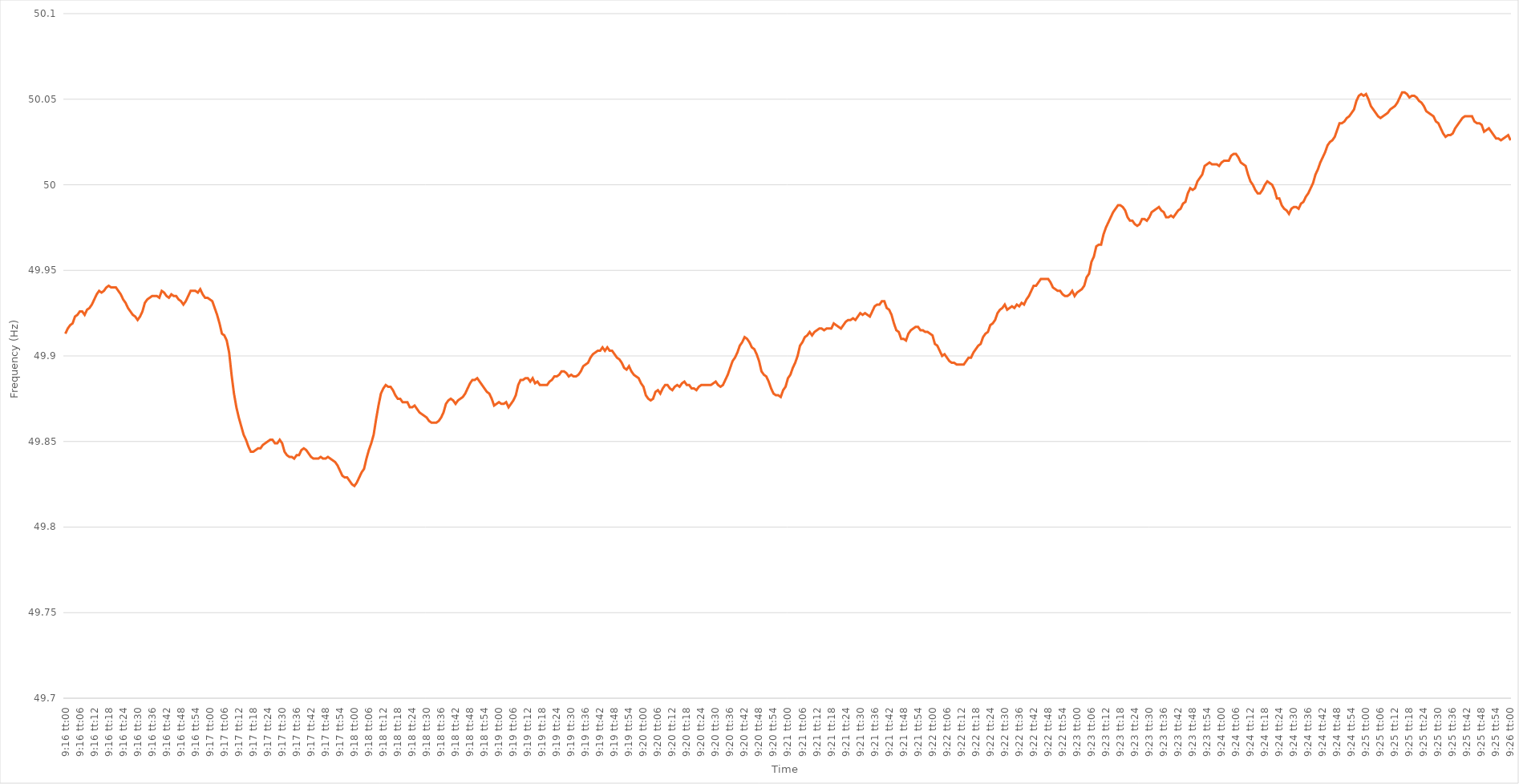
| Category | Series 0 |
|---|---|
| 0.3861111111111111 | 49.913 |
| 0.38612268518518517 | 49.916 |
| 0.3861342592592593 | 49.918 |
| 0.38614583333333335 | 49.919 |
| 0.3861574074074074 | 49.923 |
| 0.3861689814814815 | 49.924 |
| 0.3861805555555555 | 49.926 |
| 0.3861921296296296 | 49.926 |
| 0.38620370370370366 | 49.924 |
| 0.3862152777777778 | 49.927 |
| 0.38622685185185185 | 49.928 |
| 0.38623842592592594 | 49.93 |
| 0.38625 | 49.933 |
| 0.3862615740740741 | 49.936 |
| 0.3862731481481481 | 49.938 |
| 0.38628472222222227 | 49.937 |
| 0.3862962962962963 | 49.938 |
| 0.3863078703703704 | 49.94 |
| 0.38631944444444444 | 49.941 |
| 0.38633101851851853 | 49.94 |
| 0.38634259259259257 | 49.94 |
| 0.3863541666666667 | 49.94 |
| 0.38636574074074076 | 49.938 |
| 0.3863773148148148 | 49.936 |
| 0.3863888888888889 | 49.933 |
| 0.38640046296296293 | 49.931 |
| 0.386412037037037 | 49.928 |
| 0.38642361111111106 | 49.926 |
| 0.3864351851851852 | 49.924 |
| 0.38644675925925925 | 49.923 |
| 0.38645833333333335 | 49.921 |
| 0.3864699074074074 | 49.923 |
| 0.3864814814814815 | 49.926 |
| 0.3864930555555555 | 49.931 |
| 0.38650462962962967 | 49.933 |
| 0.3865162037037037 | 49.934 |
| 0.3865277777777778 | 49.935 |
| 0.38653935185185184 | 49.935 |
| 0.38655092592592594 | 49.935 |
| 0.3865625 | 49.934 |
| 0.3865740740740741 | 49.938 |
| 0.38658564814814816 | 49.937 |
| 0.3865972222222222 | 49.935 |
| 0.3866087962962963 | 49.934 |
| 0.38662037037037034 | 49.936 |
| 0.38663194444444443 | 49.935 |
| 0.38664351851851847 | 49.935 |
| 0.3866550925925926 | 49.933 |
| 0.38666666666666666 | 49.932 |
| 0.38667824074074075 | 49.93 |
| 0.3866898148148148 | 49.932 |
| 0.3867013888888889 | 49.935 |
| 0.3867129629629629 | 49.938 |
| 0.3867245370370371 | 49.938 |
| 0.3867361111111111 | 49.938 |
| 0.3867476851851852 | 49.937 |
| 0.38675925925925925 | 49.939 |
| 0.38677083333333334 | 49.936 |
| 0.3867824074074074 | 49.934 |
| 0.38679398148148153 | 49.934 |
| 0.38680555555555557 | 49.933 |
| 0.38681712962962966 | 49.932 |
| 0.3868287037037037 | 49.928 |
| 0.3868402777777778 | 49.924 |
| 0.38685185185185184 | 49.919 |
| 0.3868634259259259 | 49.913 |
| 0.386875 | 49.912 |
| 0.38688657407407406 | 49.909 |
| 0.38689814814814816 | 49.902 |
| 0.3869097222222222 | 49.889 |
| 0.3869212962962963 | 49.878 |
| 0.38693287037037033 | 49.87 |
| 0.3869444444444445 | 49.864 |
| 0.3869560185185185 | 49.859 |
| 0.3869675925925926 | 49.854 |
| 0.38697916666666665 | 49.851 |
| 0.38699074074074075 | 49.847 |
| 0.3870023148148148 | 49.844 |
| 0.38701388888888894 | 49.844 |
| 0.387025462962963 | 49.845 |
| 0.38703703703703707 | 49.846 |
| 0.3870486111111111 | 49.846 |
| 0.3870601851851852 | 49.848 |
| 0.38707175925925924 | 49.849 |
| 0.3870833333333333 | 49.85 |
| 0.38709490740740743 | 49.851 |
| 0.38710648148148147 | 49.851 |
| 0.38711805555555556 | 49.849 |
| 0.3871296296296296 | 49.849 |
| 0.3871412037037037 | 49.851 |
| 0.38715277777777773 | 49.849 |
| 0.3871643518518519 | 49.844 |
| 0.3871759259259259 | 49.842 |
| 0.3871875 | 49.841 |
| 0.38719907407407406 | 49.841 |
| 0.38721064814814815 | 49.84 |
| 0.3872222222222222 | 49.842 |
| 0.38723379629629634 | 49.842 |
| 0.3872453703703704 | 49.845 |
| 0.3872569444444445 | 49.846 |
| 0.3872685185185185 | 49.845 |
| 0.3872800925925926 | 49.843 |
| 0.38729166666666665 | 49.841 |
| 0.3873032407407407 | 49.84 |
| 0.38731481481481483 | 49.84 |
| 0.3873263888888889 | 49.84 |
| 0.38733796296296297 | 49.841 |
| 0.387349537037037 | 49.84 |
| 0.3873611111111111 | 49.84 |
| 0.38737268518518514 | 49.841 |
| 0.3873842592592593 | 49.84 |
| 0.38739583333333333 | 49.839 |
| 0.3874074074074074 | 49.838 |
| 0.38741898148148146 | 49.836 |
| 0.38743055555555556 | 49.833 |
| 0.3874421296296296 | 49.83 |
| 0.38745370370370374 | 49.829 |
| 0.3874652777777778 | 49.829 |
| 0.3874768518518519 | 49.827 |
| 0.3874884259259259 | 49.825 |
| 0.3875 | 49.824 |
| 0.38751157407407405 | 49.826 |
| 0.3875231481481482 | 49.829 |
| 0.38753472222222224 | 49.832 |
| 0.38754629629629633 | 49.834 |
| 0.38755787037037037 | 49.84 |
| 0.3875694444444444 | 49.845 |
| 0.3875810185185185 | 49.849 |
| 0.38759259259259254 | 49.854 |
| 0.3876041666666667 | 49.863 |
| 0.38761574074074073 | 49.871 |
| 0.3876273148148148 | 49.878 |
| 0.38763888888888887 | 49.881 |
| 0.38765046296296296 | 49.883 |
| 0.387662037037037 | 49.882 |
| 0.38767361111111115 | 49.882 |
| 0.3876851851851852 | 49.88 |
| 0.3876967592592593 | 49.877 |
| 0.3877083333333333 | 49.875 |
| 0.3877199074074074 | 49.875 |
| 0.38773148148148145 | 49.873 |
| 0.3877430555555556 | 49.873 |
| 0.38775462962962964 | 49.873 |
| 0.38776620370370374 | 49.87 |
| 0.3877777777777778 | 49.87 |
| 0.3877893518518518 | 49.871 |
| 0.3878009259259259 | 49.869 |
| 0.38781249999999995 | 49.867 |
| 0.3878240740740741 | 49.866 |
| 0.38783564814814814 | 49.865 |
| 0.38784722222222223 | 49.864 |
| 0.38785879629629627 | 49.862 |
| 0.38787037037037037 | 49.861 |
| 0.3878819444444444 | 49.861 |
| 0.38789351851851855 | 49.861 |
| 0.3879050925925926 | 49.862 |
| 0.3879166666666667 | 49.864 |
| 0.3879282407407407 | 49.867 |
| 0.3879398148148148 | 49.872 |
| 0.38795138888888886 | 49.874 |
| 0.387962962962963 | 49.875 |
| 0.38797453703703705 | 49.874 |
| 0.38798611111111114 | 49.872 |
| 0.3879976851851852 | 49.874 |
| 0.3880092592592593 | 49.875 |
| 0.3880208333333333 | 49.876 |
| 0.38803240740740735 | 49.878 |
| 0.3880439814814815 | 49.881 |
| 0.38805555555555554 | 49.884 |
| 0.38806712962962964 | 49.886 |
| 0.3880787037037037 | 49.886 |
| 0.38809027777777777 | 49.887 |
| 0.3881018518518518 | 49.885 |
| 0.38811342592592596 | 49.883 |
| 0.388125 | 49.881 |
| 0.3881365740740741 | 49.879 |
| 0.38814814814814813 | 49.878 |
| 0.3881597222222222 | 49.875 |
| 0.38817129629629626 | 49.871 |
| 0.3881828703703704 | 49.872 |
| 0.38819444444444445 | 49.873 |
| 0.38820601851851855 | 49.872 |
| 0.3882175925925926 | 49.872 |
| 0.3882291666666667 | 49.873 |
| 0.3882407407407407 | 49.87 |
| 0.38825231481481487 | 49.872 |
| 0.3882638888888889 | 49.874 |
| 0.38827546296296295 | 49.877 |
| 0.38828703703703704 | 49.883 |
| 0.3882986111111111 | 49.886 |
| 0.3883101851851852 | 49.886 |
| 0.3883217592592592 | 49.887 |
| 0.38833333333333336 | 49.887 |
| 0.3883449074074074 | 49.885 |
| 0.3883564814814815 | 49.887 |
| 0.38836805555555554 | 49.884 |
| 0.38837962962962963 | 49.885 |
| 0.38839120370370367 | 49.883 |
| 0.3884027777777778 | 49.883 |
| 0.38841435185185186 | 49.883 |
| 0.38842592592592595 | 49.883 |
| 0.3884375 | 49.885 |
| 0.3884490740740741 | 49.886 |
| 0.3884606481481481 | 49.888 |
| 0.3884722222222223 | 49.888 |
| 0.3884837962962963 | 49.889 |
| 0.38849537037037035 | 49.891 |
| 0.38850694444444445 | 49.891 |
| 0.3885185185185185 | 49.89 |
| 0.3885300925925926 | 49.888 |
| 0.3885416666666666 | 49.889 |
| 0.38855324074074077 | 49.888 |
| 0.3885648148148148 | 49.888 |
| 0.3885763888888889 | 49.889 |
| 0.38858796296296294 | 49.891 |
| 0.38859953703703703 | 49.894 |
| 0.3886111111111111 | 49.895 |
| 0.3886226851851852 | 49.896 |
| 0.38863425925925926 | 49.899 |
| 0.38864583333333336 | 49.901 |
| 0.3886574074074074 | 49.902 |
| 0.3886689814814815 | 49.903 |
| 0.38868055555555553 | 49.903 |
| 0.3886921296296297 | 49.905 |
| 0.3887037037037037 | 49.903 |
| 0.3887152777777778 | 49.905 |
| 0.38872685185185185 | 49.903 |
| 0.38873842592592595 | 49.903 |
| 0.38875 | 49.901 |
| 0.388761574074074 | 49.899 |
| 0.3887731481481482 | 49.898 |
| 0.3887847222222222 | 49.896 |
| 0.3887962962962963 | 49.893 |
| 0.38880787037037035 | 49.892 |
| 0.38881944444444444 | 49.894 |
| 0.3888310185185185 | 49.891 |
| 0.38884259259259263 | 49.889 |
| 0.38885416666666667 | 49.888 |
| 0.38886574074074076 | 49.887 |
| 0.3888773148148148 | 49.884 |
| 0.3888888888888889 | 49.882 |
| 0.38890046296296293 | 49.877 |
| 0.3889120370370371 | 49.875 |
| 0.3889236111111111 | 49.874 |
| 0.3889351851851852 | 49.875 |
| 0.38894675925925926 | 49.879 |
| 0.38895833333333335 | 49.88 |
| 0.3889699074074074 | 49.878 |
| 0.38898148148148143 | 49.881 |
| 0.3889930555555556 | 49.883 |
| 0.3890046296296296 | 49.883 |
| 0.3890162037037037 | 49.881 |
| 0.38902777777777775 | 49.88 |
| 0.38903935185185184 | 49.882 |
| 0.3890509259259259 | 49.883 |
| 0.38906250000000003 | 49.882 |
| 0.38907407407407407 | 49.884 |
| 0.38908564814814817 | 49.885 |
| 0.3890972222222222 | 49.883 |
| 0.3891087962962963 | 49.883 |
| 0.38912037037037034 | 49.881 |
| 0.3891319444444445 | 49.881 |
| 0.3891435185185185 | 49.88 |
| 0.3891550925925926 | 49.882 |
| 0.38916666666666666 | 49.883 |
| 0.38917824074074076 | 49.883 |
| 0.3891898148148148 | 49.883 |
| 0.38920138888888883 | 49.883 |
| 0.389212962962963 | 49.883 |
| 0.389224537037037 | 49.884 |
| 0.3892361111111111 | 49.885 |
| 0.38924768518518515 | 49.883 |
| 0.38925925925925925 | 49.882 |
| 0.3892708333333333 | 49.883 |
| 0.38928240740740744 | 49.886 |
| 0.3892939814814815 | 49.889 |
| 0.38930555555555557 | 49.893 |
| 0.3893171296296296 | 49.897 |
| 0.3893287037037037 | 49.899 |
| 0.38934027777777774 | 49.902 |
| 0.3893518518518519 | 49.906 |
| 0.38936342592592593 | 49.908 |
| 0.389375 | 49.911 |
| 0.38938657407407407 | 49.91 |
| 0.38939814814814816 | 49.908 |
| 0.3894097222222222 | 49.905 |
| 0.38942129629629635 | 49.904 |
| 0.3894328703703704 | 49.901 |
| 0.3894444444444445 | 49.897 |
| 0.3894560185185185 | 49.891 |
| 0.38946759259259256 | 49.889 |
| 0.38947916666666665 | 49.888 |
| 0.3894907407407407 | 49.885 |
| 0.38950231481481484 | 49.881 |
| 0.3895138888888889 | 49.878 |
| 0.389525462962963 | 49.877 |
| 0.389537037037037 | 49.877 |
| 0.3895486111111111 | 49.876 |
| 0.38956018518518515 | 49.88 |
| 0.3895717592592593 | 49.882 |
| 0.38958333333333334 | 49.887 |
| 0.38959490740740743 | 49.889 |
| 0.38960648148148147 | 49.893 |
| 0.38961805555555556 | 49.896 |
| 0.3896296296296296 | 49.9 |
| 0.38964120370370375 | 49.906 |
| 0.3896527777777778 | 49.908 |
| 0.3896643518518519 | 49.911 |
| 0.3896759259259259 | 49.912 |
| 0.38968749999999996 | 49.914 |
| 0.38969907407407406 | 49.912 |
| 0.3897106481481481 | 49.914 |
| 0.38972222222222225 | 49.915 |
| 0.3897337962962963 | 49.916 |
| 0.3897453703703704 | 49.916 |
| 0.3897569444444444 | 49.915 |
| 0.3897685185185185 | 49.916 |
| 0.38978009259259255 | 49.916 |
| 0.3897916666666667 | 49.916 |
| 0.38980324074074074 | 49.919 |
| 0.38981481481481484 | 49.918 |
| 0.3898263888888889 | 49.917 |
| 0.38983796296296297 | 49.916 |
| 0.389849537037037 | 49.918 |
| 0.38986111111111116 | 49.92 |
| 0.3898726851851852 | 49.921 |
| 0.3898842592592593 | 49.921 |
| 0.38989583333333333 | 49.922 |
| 0.38990740740740737 | 49.921 |
| 0.38991898148148146 | 49.923 |
| 0.3899305555555555 | 49.925 |
| 0.38994212962962965 | 49.924 |
| 0.3899537037037037 | 49.925 |
| 0.3899652777777778 | 49.924 |
| 0.3899768518518518 | 49.923 |
| 0.3899884259259259 | 49.926 |
| 0.38999999999999996 | 49.929 |
| 0.3900115740740741 | 49.93 |
| 0.39002314814814815 | 49.93 |
| 0.39003472222222224 | 49.932 |
| 0.3900462962962963 | 49.932 |
| 0.3900578703703704 | 49.928 |
| 0.3900694444444444 | 49.927 |
| 0.39008101851851856 | 49.924 |
| 0.3900925925925926 | 49.919 |
| 0.3901041666666667 | 49.915 |
| 0.39011574074074074 | 49.914 |
| 0.39012731481481483 | 49.91 |
| 0.39013888888888887 | 49.91 |
| 0.390150462962963 | 49.909 |
| 0.39016203703703706 | 49.913 |
| 0.3901736111111111 | 49.915 |
| 0.3901851851851852 | 49.916 |
| 0.39019675925925923 | 49.917 |
| 0.3902083333333333 | 49.917 |
| 0.39021990740740736 | 49.915 |
| 0.3902314814814815 | 49.915 |
| 0.39024305555555555 | 49.914 |
| 0.39025462962962965 | 49.914 |
| 0.3902662037037037 | 49.913 |
| 0.3902777777777778 | 49.912 |
| 0.3902893518518518 | 49.907 |
| 0.39030092592592597 | 49.906 |
| 0.3903125 | 49.903 |
| 0.3903240740740741 | 49.9 |
| 0.39033564814814814 | 49.901 |
| 0.39034722222222223 | 49.899 |
| 0.3903587962962963 | 49.897 |
| 0.3903703703703704 | 49.896 |
| 0.39038194444444446 | 49.896 |
| 0.3903935185185185 | 49.895 |
| 0.3904050925925926 | 49.895 |
| 0.39041666666666663 | 49.895 |
| 0.39042824074074073 | 49.895 |
| 0.39043981481481477 | 49.897 |
| 0.3904513888888889 | 49.899 |
| 0.39046296296296296 | 49.899 |
| 0.39047453703703705 | 49.902 |
| 0.3904861111111111 | 49.904 |
| 0.3904976851851852 | 49.906 |
| 0.3905092592592592 | 49.907 |
| 0.3905208333333334 | 49.911 |
| 0.3905324074074074 | 49.913 |
| 0.3905439814814815 | 49.914 |
| 0.39055555555555554 | 49.918 |
| 0.39056712962962964 | 49.919 |
| 0.3905787037037037 | 49.921 |
| 0.39059027777777783 | 49.925 |
| 0.39060185185185187 | 49.927 |
| 0.39061342592592596 | 49.928 |
| 0.390625 | 49.93 |
| 0.39063657407407404 | 49.927 |
| 0.39064814814814813 | 49.928 |
| 0.39065972222222217 | 49.929 |
| 0.3906712962962963 | 49.928 |
| 0.39068287037037036 | 49.93 |
| 0.39069444444444446 | 49.929 |
| 0.3907060185185185 | 49.931 |
| 0.3907175925925926 | 49.93 |
| 0.3907291666666666 | 49.933 |
| 0.3907407407407408 | 49.935 |
| 0.3907523148148148 | 49.938 |
| 0.3907638888888889 | 49.941 |
| 0.39077546296296295 | 49.941 |
| 0.39078703703703704 | 49.943 |
| 0.3907986111111111 | 49.945 |
| 0.39081018518518523 | 49.945 |
| 0.39082175925925927 | 49.945 |
| 0.39083333333333337 | 49.945 |
| 0.3908449074074074 | 49.943 |
| 0.3908564814814815 | 49.94 |
| 0.39086805555555554 | 49.939 |
| 0.3908796296296296 | 49.938 |
| 0.3908912037037037 | 49.938 |
| 0.39090277777777777 | 49.936 |
| 0.39091435185185186 | 49.935 |
| 0.3909259259259259 | 49.935 |
| 0.3909375 | 49.936 |
| 0.39094907407407403 | 49.938 |
| 0.3909606481481482 | 49.935 |
| 0.3909722222222222 | 49.937 |
| 0.3909837962962963 | 49.938 |
| 0.39099537037037035 | 49.939 |
| 0.39100694444444445 | 49.941 |
| 0.3910185185185185 | 49.946 |
| 0.39103009259259264 | 49.948 |
| 0.3910416666666667 | 49.955 |
| 0.39105324074074077 | 49.958 |
| 0.3910648148148148 | 49.964 |
| 0.3910763888888889 | 49.965 |
| 0.39108796296296294 | 49.965 |
| 0.391099537037037 | 49.971 |
| 0.39111111111111113 | 49.975 |
| 0.39112268518518517 | 49.978 |
| 0.39113425925925926 | 49.981 |
| 0.3911458333333333 | 49.984 |
| 0.3911574074074074 | 49.986 |
| 0.39116898148148144 | 49.988 |
| 0.3911805555555556 | 49.988 |
| 0.3911921296296296 | 49.987 |
| 0.3912037037037037 | 49.985 |
| 0.39121527777777776 | 49.981 |
| 0.39122685185185185 | 49.979 |
| 0.3912384259259259 | 49.979 |
| 0.39125000000000004 | 49.977 |
| 0.3912615740740741 | 49.976 |
| 0.3912731481481482 | 49.977 |
| 0.3912847222222222 | 49.98 |
| 0.3912962962962963 | 49.98 |
| 0.39130787037037035 | 49.979 |
| 0.3913194444444445 | 49.981 |
| 0.39133101851851854 | 49.984 |
| 0.39134259259259263 | 49.985 |
| 0.39135416666666667 | 49.986 |
| 0.3913657407407407 | 49.987 |
| 0.3913773148148148 | 49.985 |
| 0.39138888888888884 | 49.984 |
| 0.391400462962963 | 49.981 |
| 0.39141203703703703 | 49.981 |
| 0.3914236111111111 | 49.982 |
| 0.39143518518518516 | 49.981 |
| 0.39144675925925926 | 49.983 |
| 0.3914583333333333 | 49.985 |
| 0.39146990740740745 | 49.986 |
| 0.3914814814814815 | 49.989 |
| 0.3914930555555556 | 49.99 |
| 0.3915046296296296 | 49.995 |
| 0.3915162037037037 | 49.998 |
| 0.39152777777777775 | 49.997 |
| 0.3915393518518519 | 49.998 |
| 0.39155092592592594 | 50.002 |
| 0.39156250000000004 | 50.004 |
| 0.3915740740740741 | 50.006 |
| 0.3915856481481481 | 50.011 |
| 0.3915972222222222 | 50.012 |
| 0.39160879629629625 | 50.013 |
| 0.3916203703703704 | 50.012 |
| 0.39163194444444444 | 50.012 |
| 0.39164351851851853 | 50.012 |
| 0.39165509259259257 | 50.011 |
| 0.39166666666666666 | 50.013 |
| 0.3916782407407407 | 50.014 |
| 0.39168981481481485 | 50.014 |
| 0.3917013888888889 | 50.014 |
| 0.391712962962963 | 50.017 |
| 0.391724537037037 | 50.018 |
| 0.3917361111111111 | 50.018 |
| 0.39174768518518516 | 50.016 |
| 0.3917592592592593 | 50.013 |
| 0.39177083333333335 | 50.012 |
| 0.39178240740740744 | 50.011 |
| 0.3917939814814815 | 50.006 |
| 0.3918055555555555 | 50.002 |
| 0.3918171296296296 | 50 |
| 0.39182870370370365 | 49.997 |
| 0.3918402777777778 | 49.995 |
| 0.39185185185185184 | 49.995 |
| 0.39186342592592593 | 49.997 |
| 0.391875 | 50 |
| 0.39188657407407407 | 50.002 |
| 0.3918981481481481 | 50.001 |
| 0.39190972222222226 | 50 |
| 0.3919212962962963 | 49.997 |
| 0.3919328703703704 | 49.992 |
| 0.39194444444444443 | 49.992 |
| 0.3919560185185185 | 49.988 |
| 0.39196759259259256 | 49.986 |
| 0.3919791666666667 | 49.985 |
| 0.39199074074074075 | 49.983 |
| 0.39200231481481485 | 49.986 |
| 0.3920138888888889 | 49.987 |
| 0.392025462962963 | 49.987 |
| 0.392037037037037 | 49.986 |
| 0.39204861111111117 | 49.989 |
| 0.3920601851851852 | 49.99 |
| 0.39207175925925924 | 49.993 |
| 0.39208333333333334 | 49.995 |
| 0.3920949074074074 | 49.998 |
| 0.3921064814814815 | 50.001 |
| 0.3921180555555555 | 50.006 |
| 0.39212962962962966 | 50.009 |
| 0.3921412037037037 | 50.013 |
| 0.3921527777777778 | 50.016 |
| 0.39216435185185183 | 50.019 |
| 0.39217592592592593 | 50.023 |
| 0.39218749999999997 | 50.025 |
| 0.3921990740740741 | 50.026 |
| 0.39221064814814816 | 50.028 |
| 0.39222222222222225 | 50.032 |
| 0.3922337962962963 | 50.036 |
| 0.3922453703703704 | 50.036 |
| 0.3922569444444444 | 50.037 |
| 0.39226851851851857 | 50.039 |
| 0.3922800925925926 | 50.04 |
| 0.39229166666666665 | 50.042 |
| 0.39230324074074074 | 50.044 |
| 0.3923148148148148 | 50.049 |
| 0.3923263888888889 | 50.052 |
| 0.3923379629629629 | 50.053 |
| 0.39234953703703707 | 50.052 |
| 0.3923611111111111 | 50.053 |
| 0.3923726851851852 | 50.05 |
| 0.39238425925925924 | 50.046 |
| 0.39239583333333333 | 50.044 |
| 0.39240740740740737 | 50.042 |
| 0.3924189814814815 | 50.04 |
| 0.39243055555555556 | 50.039 |
| 0.39244212962962965 | 50.04 |
| 0.3924537037037037 | 50.041 |
| 0.3924652777777778 | 50.042 |
| 0.3924768518518518 | 50.044 |
| 0.392488425925926 | 50.045 |
| 0.3925 | 50.046 |
| 0.39251157407407405 | 50.048 |
| 0.39252314814814815 | 50.051 |
| 0.3925347222222222 | 50.054 |
| 0.3925462962962963 | 50.054 |
| 0.3925578703703703 | 50.053 |
| 0.39256944444444447 | 50.051 |
| 0.3925810185185185 | 50.052 |
| 0.3925925925925926 | 50.052 |
| 0.39260416666666664 | 50.051 |
| 0.39261574074074074 | 50.049 |
| 0.3926273148148148 | 50.048 |
| 0.3926388888888889 | 50.046 |
| 0.39265046296296297 | 50.043 |
| 0.39266203703703706 | 50.042 |
| 0.3926736111111111 | 50.041 |
| 0.3926851851851852 | 50.04 |
| 0.39269675925925923 | 50.037 |
| 0.3927083333333334 | 50.036 |
| 0.3927199074074074 | 50.033 |
| 0.3927314814814815 | 50.03 |
| 0.39274305555555555 | 50.028 |
| 0.39275462962962965 | 50.029 |
| 0.3927662037037037 | 50.029 |
| 0.3927777777777777 | 50.03 |
| 0.3927893518518519 | 50.033 |
| 0.3928009259259259 | 50.035 |
| 0.3928125 | 50.037 |
| 0.39282407407407405 | 50.039 |
| 0.39283564814814814 | 50.04 |
| 0.3928472222222222 | 50.04 |
| 0.39285879629629633 | 50.04 |
| 0.39287037037037037 | 50.04 |
| 0.39288194444444446 | 50.037 |
| 0.3928935185185185 | 50.036 |
| 0.3929050925925926 | 50.036 |
| 0.39291666666666664 | 50.035 |
| 0.3929282407407408 | 50.031 |
| 0.3929398148148148 | 50.032 |
| 0.3929513888888889 | 50.033 |
| 0.39296296296296296 | 50.031 |
| 0.39297453703703705 | 50.029 |
| 0.3929861111111111 | 50.027 |
| 0.39299768518518513 | 50.027 |
| 0.3930092592592593 | 50.026 |
| 0.3930208333333333 | 50.027 |
| 0.3930324074074074 | 50.028 |
| 0.39304398148148145 | 50.029 |
| 0.39305555555555555 | 50.026 |